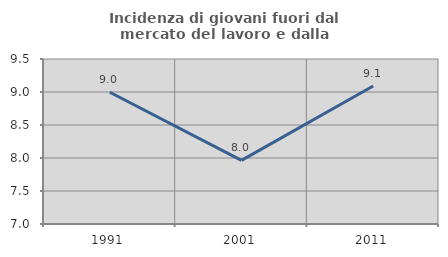
| Category | Incidenza di giovani fuori dal mercato del lavoro e dalla formazione  |
|---|---|
| 1991.0 | 8.997 |
| 2001.0 | 7.965 |
| 2011.0 | 9.091 |